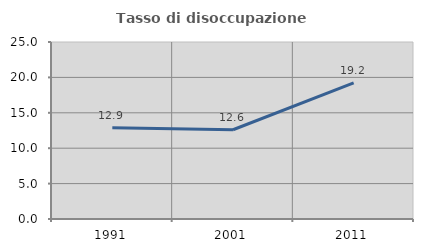
| Category | Tasso di disoccupazione giovanile  |
|---|---|
| 1991.0 | 12.903 |
| 2001.0 | 12.605 |
| 2011.0 | 19.231 |